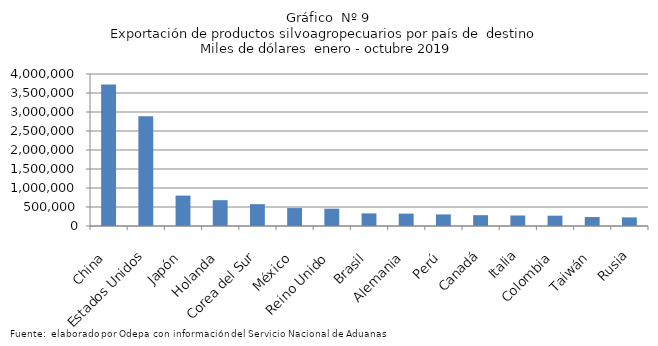
| Category | Series 0 |
|---|---|
| China | 3724394.134 |
| Estados Unidos | 2890292.673 |
| Japón | 800050.555 |
| Holanda | 679302.38 |
| Corea del Sur | 574867.614 |
| México | 472086.745 |
| Reino Unido | 455387.464 |
| Brasil | 331874.407 |
| Alemania | 325826.184 |
| Perú | 304742.853 |
| Canadá | 284545.988 |
| Italia | 276848.6 |
| Colombia | 271540.269 |
| Taiwán | 235359.971 |
| Rusia | 226410.478 |